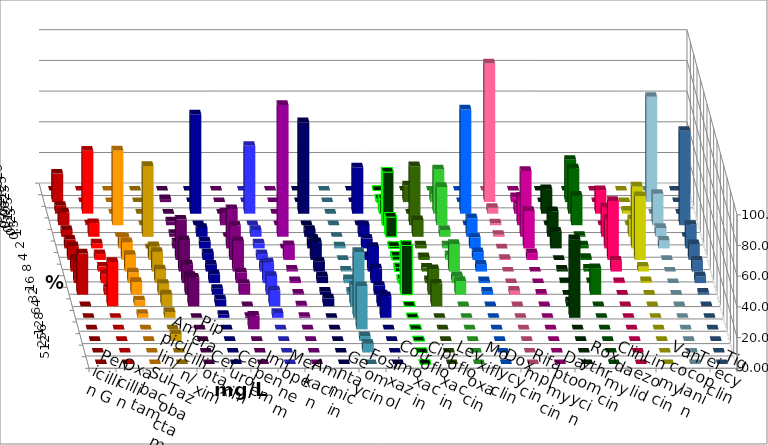
| Category | Penicillin G | Oxacillin | Ampicillin/ Sulbactam | Piperacillin/ Tazobactam | Cefotaxim | Cefuroxim | Imipenem | Meropenem | Amikacin | Gentamicin | Fosfomycin | Cotrimoxazol | Ciprofloxacin | Levofloxacin | Moxifloxacin | Doxycyclin | Rifampicin | Daptomycin | Roxythromycin | Clindamycin | Linezolid | Vancomycin | Teicoplanin | Tigecyclin |
|---|---|---|---|---|---|---|---|---|---|---|---|---|---|---|---|---|---|---|---|---|---|---|---|---|
| 0.015625 | 0 | 0 | 0 | 0 | 0 | 0 | 0 | 0 | 0 | 0 | 0 | 0 | 0 | 0 | 0 | 0 | 0 | 0 | 0 | 0 | 0 | 0 | 0 | 0 |
| 0.03125 | 18.59 | 0 | 0 | 0 | 1.923 | 0 | 0 | 0 | 0 | 0 | 0 | 0 | 1.923 | 10.897 | 5.128 | 0 | 90.385 | 3.205 | 0 | 27.564 | 0 | 0 | 0 | 68.59 |
| 0.0625 | 5.128 | 41.026 | 0 | 0 | 0 | 0 | 64.744 | 44.231 | 0 | 59.615 | 0 | 30.128 | 9.615 | 0 | 28.846 | 67.949 | 3.846 | 5.769 | 16.026 | 29.487 | 15.385 | 1.923 | 0 | 0 |
| 0.125 | 8.333 | 0.641 | 48.718 | 0 | 2.564 | 8.333 | 0 | 0 | 0 | 0 | 0 | 0 | 34.615 | 38.462 | 25 | 0 | 1.282 | 18.59 | 0 | 19.231 | 0 | 0 | 61.538 | 20.513 |
| 0.25 | 4.487 | 8.974 | 0 | 46.154 | 1.923 | 0 | 5.769 | 4.487 | 85.897 | 4.487 | 0 | 7.692 | 12.821 | 10.897 | 4.487 | 12.179 | 1.282 | 42.949 | 16.667 | 0.641 | 19.231 | 11.538 | 0 | 5.769 |
| 0.5 | 5.769 | 3.205 | 7.051 | 0 | 3.846 | 25.641 | 4.487 | 3.205 | 0 | 6.41 | 1.282 | 6.41 | 1.282 | 1.923 | 1.923 | 7.051 | 0 | 24.359 | 10.897 | 1.923 | 19.231 | 40.385 | 15.385 | 5.128 |
| 1.0 | 8.974 | 3.846 | 11.538 | 8.974 | 26.282 | 22.436 | 4.487 | 3.846 | 9.615 | 11.538 | 0 | 2.564 | 2.564 | 1.923 | 3.205 | 5.128 | 0.641 | 4.487 | 0 | 1.282 | 38.462 | 41.667 | 10.256 | 0 |
| 2.0 | 8.333 | 3.205 | 10.897 | 12.821 | 20.513 | 19.872 | 4.487 | 5.128 | 1.282 | 6.41 | 0.641 | 16.026 | 2.564 | 2.564 | 17.949 | 4.487 | 0 | 0 | 1.282 | 1.923 | 7.051 | 3.205 | 7.051 | 0 |
| 4.0 | 13.462 | 5.769 | 7.051 | 8.974 | 12.179 | 7.051 | 5.769 | 13.462 | 1.282 | 4.487 | 2.564 | 9.615 | 2.564 | 1.923 | 4.487 | 1.282 | 0 | 0 | 0.641 | 0.641 | 0.641 | 1.282 | 4.487 | 0 |
| 8.0 | 26.923 | 4.487 | 8.333 | 7.051 | 12.179 | 7.051 | 3.846 | 12.179 | 0.641 | 1.923 | 1.923 | 5.769 | 32.051 | 16.667 | 8.974 | 1.923 | 2.564 | 0.641 | 0 | 17.308 | 0 | 0 | 1.282 | 0 |
| 16.0 | 0 | 28.846 | 3.846 | 7.692 | 18.59 | 0 | 4.487 | 10.256 | 0.641 | 5.128 | 13.462 | 7.692 | 0 | 14.744 | 0 | 0 | 0 | 0 | 3.205 | 0 | 0 | 0 | 0 | 0 |
| 32.0 | 0 | 0 | 2.564 | 3.846 | 0 | 0.641 | 1.923 | 3.205 | 0.641 | 0 | 42.949 | 14.103 | 0 | 0 | 0 | 0 | 0 | 0 | 51.282 | 0 | 0 | 0 | 0 | 0 |
| 64.0 | 0 | 0 | 0 | 0 | 0 | 8.974 | 0 | 0 | 0 | 0 | 28.205 | 0 | 0 | 0 | 0 | 0 | 0 | 0 | 0 | 0 | 0 | 0 | 0 | 0 |
| 128.0 | 0 | 0 | 0 | 4.487 | 0 | 0 | 0 | 0 | 0 | 0 | 3.205 | 0 | 0 | 0 | 0 | 0 | 0 | 0 | 0 | 0 | 0 | 0 | 0 | 0 |
| 256.0 | 0 | 0 | 0 | 0 | 0 | 0 | 0 | 0 | 0 | 0 | 5.769 | 0 | 0 | 0 | 0 | 0 | 0 | 0 | 0 | 0 | 0 | 0 | 0 | 0 |
| 512.0 | 0 | 0 | 0 | 0 | 0 | 0 | 0 | 0 | 0 | 0 | 0 | 0 | 0 | 0 | 0 | 0 | 0 | 0 | 0 | 0 | 0 | 0 | 0 | 0 |